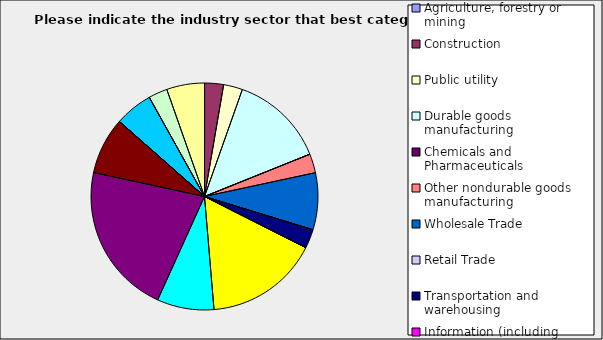
| Category | Series 0 |
|---|---|
| Agriculture, forestry or mining | 0 |
| Construction | 0.027 |
| Public utility | 0.027 |
| Durable goods manufacturing | 0.135 |
| Chemicals and Pharmaceuticals | 0 |
| Other nondurable goods manufacturing | 0.027 |
| Wholesale Trade | 0.081 |
| Retail Trade | 0 |
| Transportation and warehousing | 0.027 |
| Information (including broadcasting and telecommunication) | 0 |
| Finance and Insurance | 0.162 |
| Real Estate | 0.081 |
| Professional, scientific and technical services | 0.216 |
| Consulting | 0.081 |
| Administrative and office services (including waste management) | 0 |
| Education | 0 |
| Health Care and social services | 0.054 |
| Arts, entertainment and recreation | 0 |
| Accommodation and food services | 0.027 |
| Other | 0.054 |